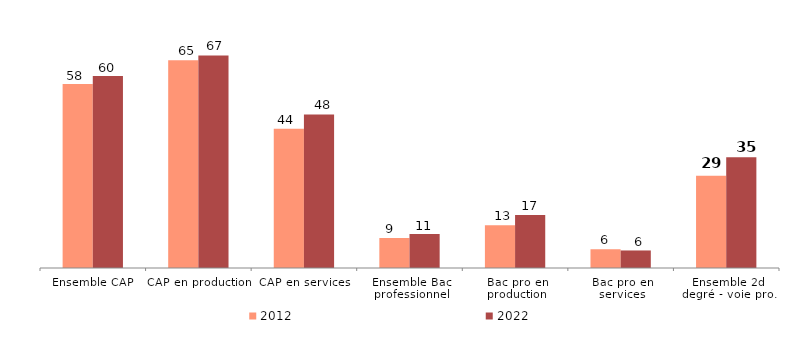
| Category | 2012 | 2022 |
|---|---|---|
| Ensemble CAP | 57.976 | 60.452 |
| CAP en production | 65.455 | 66.953 |
| CAP en services | 43.872 | 48.373 |
| Ensemble Bac professionnel | 9.451 | 10.746 |
| Bac pro en production | 13.473 | 16.676 |
| Bac pro en services | 5.907 | 5.525 |
| Ensemble 2d degré - voie pro. | 29.065 | 34.883 |